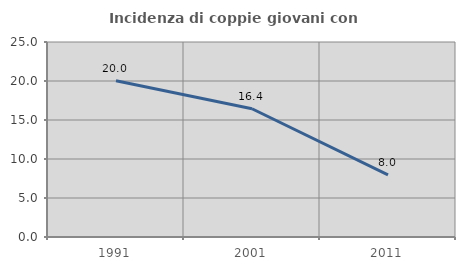
| Category | Incidenza di coppie giovani con figli |
|---|---|
| 1991.0 | 20.031 |
| 2001.0 | 16.445 |
| 2011.0 | 7.971 |